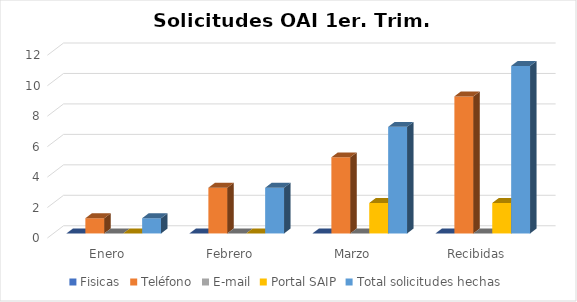
| Category | Fisicas | Teléfono | E-mail | Portal SAIP | Total solicitudes hechas |
|---|---|---|---|---|---|
| Enero | 0 | 1 | 0 | 0 | 1 |
| Febrero | 0 | 3 | 0 | 0 | 3 |
| Marzo | 0 | 5 | 0 | 2 | 7 |
| Recibidas | 0 | 9 | 0 | 2 | 11 |